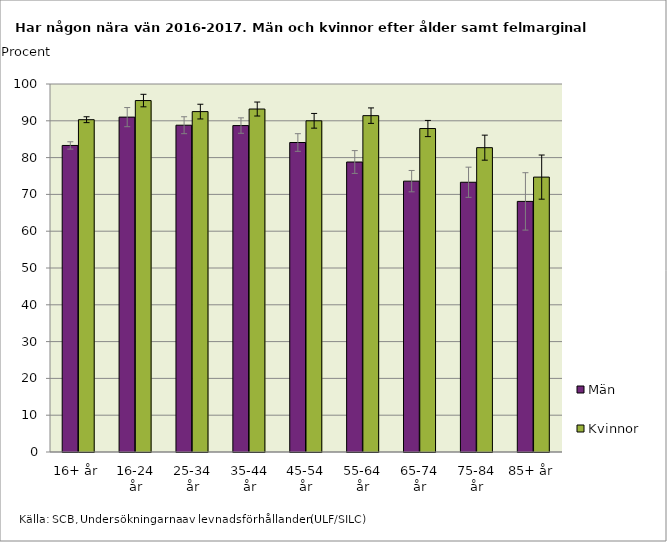
| Category | Män | Kvinnor |
|---|---|---|
| 16+ år | 83.3 | 90.3 |
| 16-24 år | 91 | 95.5 |
| 25-34 år | 88.8 | 92.5 |
| 35-44 år | 88.7 | 93.2 |
| 45-54 år | 84.1 | 90 |
| 55-64 år | 78.8 | 91.4 |
| 65-74 år | 73.6 | 87.9 |
| 75-84 år | 73.3 | 82.7 |
| 85+ år | 68.1 | 74.7 |